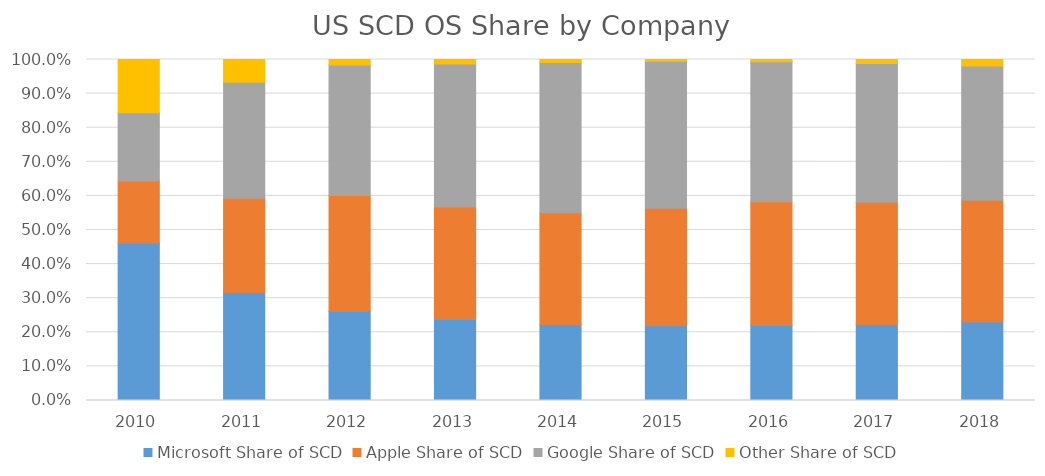
| Category | Microsoft Share of SCD | Apple Share of SCD | Google Share of SCD | Other Share of SCD |
|---|---|---|---|---|
| 2010.0 | 0.461 | 0.183 | 0.2 | 0.156 |
| 2011.0 | 0.316 | 0.277 | 0.34 | 0.067 |
| 2012.0 | 0.261 | 0.341 | 0.382 | 0.016 |
| 2013.0 | 0.238 | 0.329 | 0.42 | 0.013 |
| 2014.0 | 0.223 | 0.328 | 0.441 | 0.009 |
| 2015.0 | 0.219 | 0.345 | 0.43 | 0.005 |
| 2016.0 | 0.22 | 0.363 | 0.41 | 0.007 |
| 2017.0 | 0.223 | 0.359 | 0.407 | 0.011 |
| 2018.0 | 0.23 | 0.357 | 0.394 | 0.019 |